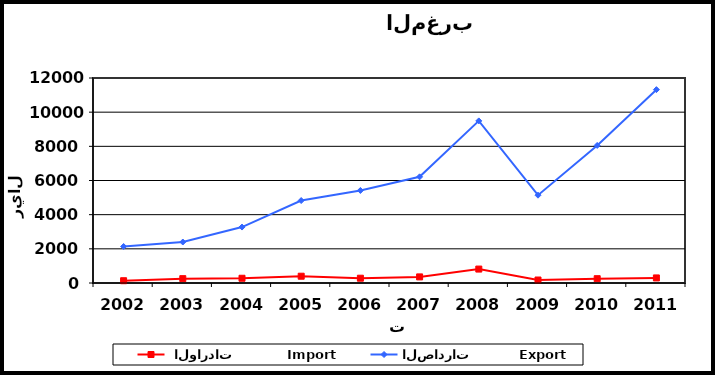
| Category |  الواردات           Import | الصادرات          Export |
|---|---|---|
| 2002.0 | 133 | 2137 |
| 2003.0 | 255 | 2399 |
| 2004.0 | 278 | 3275 |
| 2005.0 | 397 | 4827 |
| 2006.0 | 280 | 5417 |
| 2007.0 | 357 | 6214 |
| 2008.0 | 815 | 9489 |
| 2009.0 | 174 | 5141 |
| 2010.0 | 253 | 8053 |
| 2011.0 | 297 | 11318 |